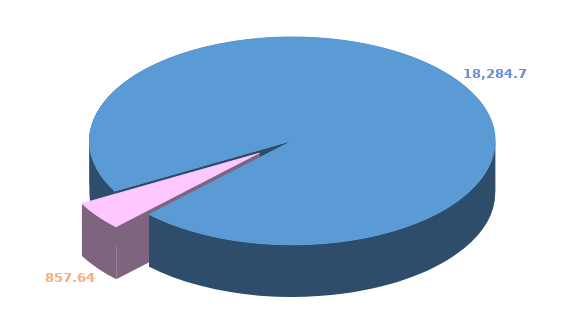
| Category | Series 0 |
|---|---|
| 0 | 18284.699 |
| 1 | 857.639 |